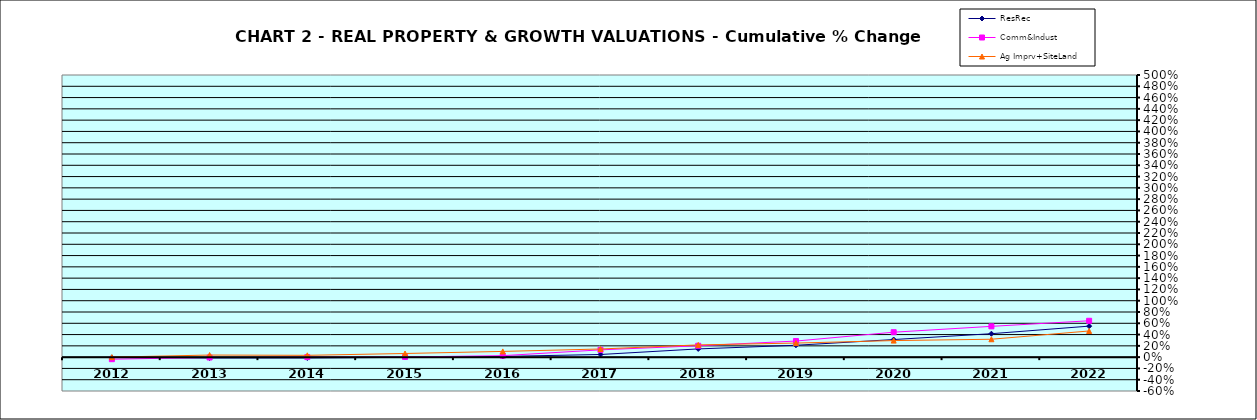
| Category | ResRec | Comm&Indust | Ag Imprv+SiteLand |
|---|---|---|---|
| 2012.0 | -0.005 | -0.036 | 0 |
| 2013.0 | -0.016 | -0.006 | 0.037 |
| 2014.0 | -0.015 | 0.001 | 0.032 |
| 2015.0 | -0.004 | 0.003 | 0.065 |
| 2016.0 | 0.013 | 0.026 | 0.101 |
| 2017.0 | 0.047 | 0.129 | 0.144 |
| 2018.0 | 0.146 | 0.202 | 0.217 |
| 2019.0 | 0.21 | 0.285 | 0.249 |
| 2020.0 | 0.312 | 0.442 | 0.293 |
| 2021.0 | 0.415 | 0.546 | 0.317 |
| 2022.0 | 0.55 | 0.644 | 0.464 |